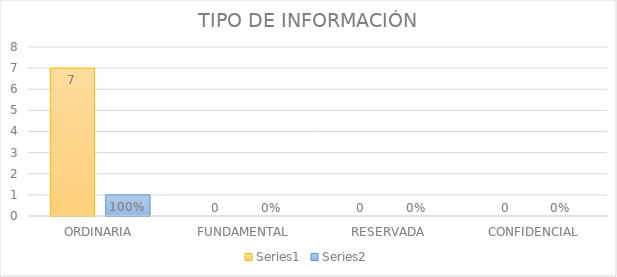
| Category | Series 3 | Series 4 |
|---|---|---|
| ORDINARIA | 7 | 1 |
| FUNDAMENTAL | 0 | 0 |
| RESERVADA | 0 | 0 |
| CONFIDENCIAL | 0 | 0 |